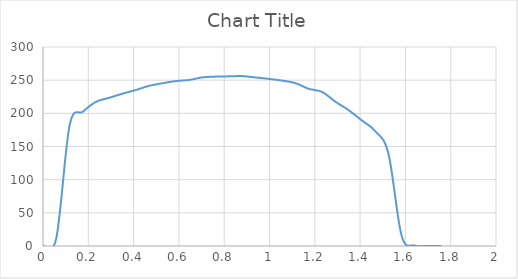
| Category | Series 0 |
|---|---|
| 0.0 | 0 |
| 0.058651739999999994 | 11.634 |
| 0.11730347999999999 | 181.716 |
| 0.17595522 | 202.47 |
| 0.23460695999999998 | 217.452 |
| 0.2932587 | 223.56 |
| 0.35191044 | 229.74 |
| 0.41056218 | 235.224 |
| 0.46921391999999995 | 241.56 |
| 0.52786566 | 245.376 |
| 0.5865174 | 248.616 |
| 0.6451691399999999 | 250.314 |
| 0.70382088 | 254.214 |
| 0.76247262 | 255.384 |
| 0.82112436 | 255.75 |
| 0.8797761 | 256.092 |
| 0.9384278399999999 | 254.088 |
| 0.9970795799999999 | 251.94 |
| 1.05573132 | 249.324 |
| 1.11438306 | 245.598 |
| 1.1730348 | 236.964 |
| 1.23168654 | 232.35 |
| 1.2903382799999998 | 217.674 |
| 1.34899002 | 204.9 |
| 1.40764176 | 189.33 |
| 1.4662935 | 173.298 |
| 1.52494524 | 139.38 |
| 1.5835969799999998 | 15.168 |
| 1.64224872 | 0.618 |
| 1.70090046 | 0.162 |
| 1.7595522 | 0 |